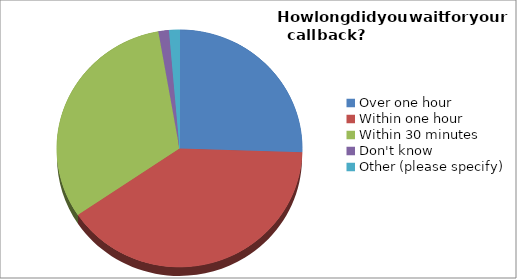
| Category | Series 0 |
|---|---|
| Over one hour | 37 |
| Within one hour | 58 |
| Within 30 minutes | 46 |
| Don't know | 2 |
| Other (please specify) | 2 |